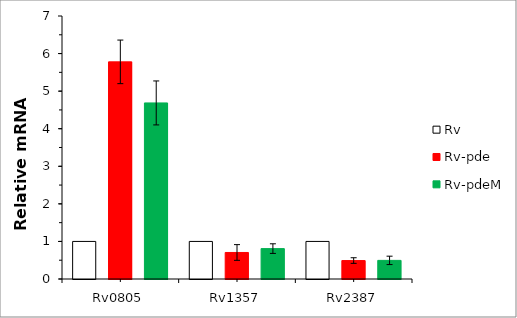
| Category | Rv | Rv-pde | Rv-pdeM |
|---|---|---|---|
| Rv0805 | 1 | 5.779 | 4.686 |
| Rv1357 | 1 | 0.706 | 0.809 |
| Rv2387 | 1 | 0.491 | 0.496 |